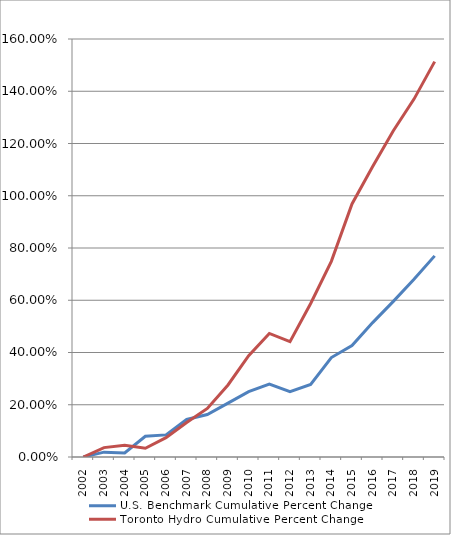
| Category | U.S. Benchmark Cumulative Percent Change | Toronto Hydro Cumulative Percent Change |
|---|---|---|
| 2002.0 | 0 | 0 |
| 2003.0 | 0.019 | 0.036 |
| 2004.0 | 0.015 | 0.045 |
| 2005.0 | 0.08 | 0.034 |
| 2006.0 | 0.085 | 0.074 |
| 2007.0 | 0.144 | 0.132 |
| 2008.0 | 0.162 | 0.186 |
| 2009.0 | 0.206 | 0.276 |
| 2010.0 | 0.25 | 0.388 |
| 2011.0 | 0.279 | 0.473 |
| 2012.0 | 0.25 | 0.442 |
| 2013.0 | 0.277 | 0.587 |
| 2014.0 | 0.381 | 0.749 |
| 2015.0 | 0.426 | 0.969 |
| 2016.0 | 0.514 | 1.112 |
| 2017.0 | 0.596 | 1.249 |
| 2018.0 | 0.68 | 1.37 |
| 2019.0 | 0.77 | 1.513 |